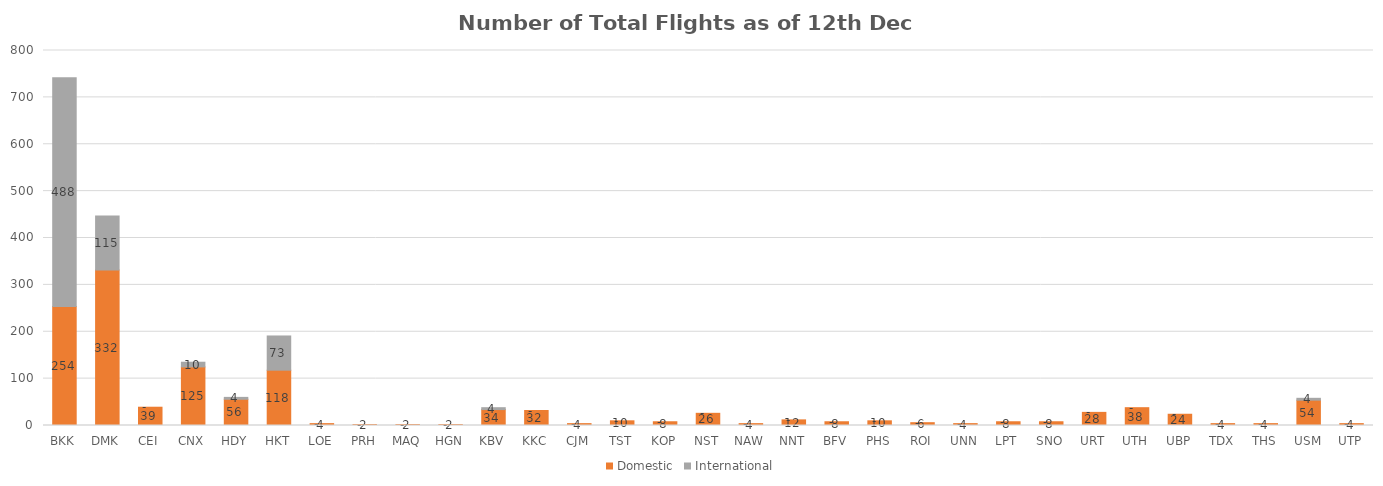
| Category | Domestic | International |
|---|---|---|
| BKK | 254 | 488 |
| DMK | 332 | 115 |
| CEI | 39 | 0 |
| CNX | 125 | 10 |
| HDY | 56 | 4 |
| HKT | 118 | 73 |
| LOE | 4 | 0 |
| PRH | 2 | 0 |
| MAQ | 2 | 0 |
| HGN | 2 | 0 |
| KBV | 34 | 4 |
| KKC | 32 | 0 |
| CJM | 4 | 0 |
| TST | 10 | 0 |
| KOP | 8 | 0 |
| NST | 26 | 0 |
| NAW | 4 | 0 |
| NNT | 12 | 0 |
| BFV | 8 | 0 |
| PHS | 10 | 0 |
| ROI | 6 | 0 |
| UNN | 4 | 0 |
| LPT | 8 | 0 |
| SNO | 8 | 0 |
| URT | 28 | 0 |
| UTH | 38 | 0 |
| UBP | 24 | 0 |
| TDX | 4 | 0 |
| THS | 4 | 0 |
| USM | 54 | 4 |
| UTP | 4 | 0 |